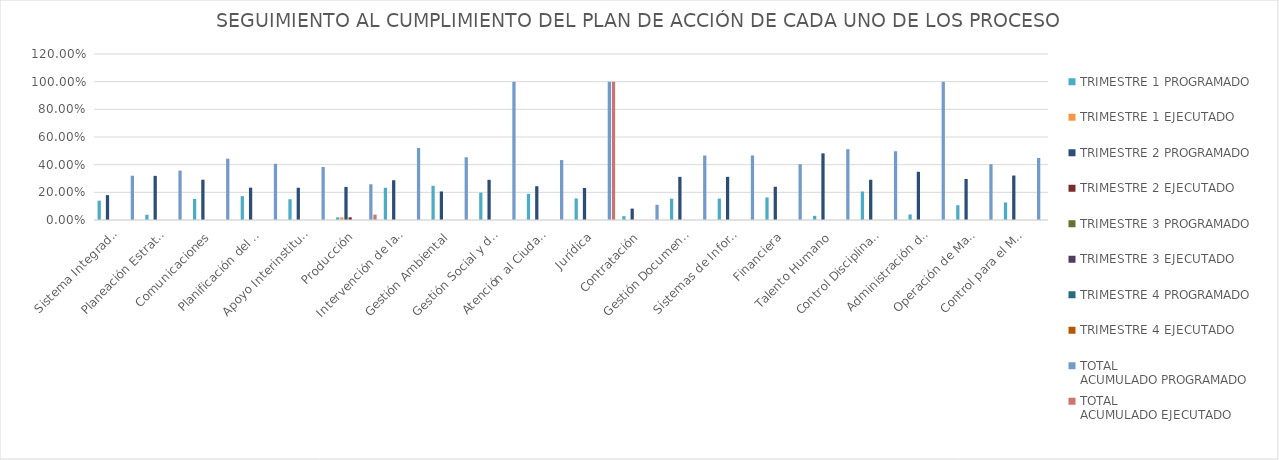
| Category | TRIMESTRE 1 | TRIMESTRE 2 | TRIMESTRE 3 | TRIMESTRE 4 | TOTAL
ACUMULADO |
|---|---|---|---|---|---|
| Sistema Integrado de Gestión | 0 | 0 | 0 | 0 | 0 |
| Planeación Estratégica | 0 | 0 | 0 | 0 | 0 |
| Comunicaciones | 0 | 0 | 0 | 0 | 0 |
| Planificación del Desarrollo Vial Local | 0 | 0 | 0 | 0 | 0 |
| Apoyo Interinstitucional | 0 | 0 | 0 | 0 | 0 |
| Producción | 0.019 | 0.019 | 0 | 0 | 0.038 |
| Intervención de la Malla Vial Local | 0 | 0 | 0 | 0 | 0 |
| Gestión Ambiental | 0 | 0 | 0 | 0 | 0 |
| Gestión Social y de Atención a Partes Interesadas | 0 | 0 | 0 | 0 | 0 |
| Atención al Ciudadano | 0 | 0 | 0 | 0 | 0 |
| Jurídica | 0 | 0 | 0 | 0 | 0.999 |
| Contratación | 0 | 0 | 0 | 0 | 0 |
| Gestión Documental | 0 | 0 | 0 | 0 | 0 |
| Sistemas de Información y Tecnología | 0 | 0 | 0 | 0 | 0 |
| Financiera | 0 | 0 | 0 | 0 | 0 |
| Talento Humano | 0 | 0 | 0 | 0 | 0 |
| Control Disciplinario Interno | 0 | 0 | 0 | 0 | 0 |
| Administración de Bienes e Infraestructura | 0 | 0 | 0 | 0 | 0 |
| Operación de Maquinaria | 0 | 0 | 0 | 0 | 0 |
| Control para el Mejoramiento Continuo de la Gestión | 0 | 0 | 0 | 0 | 0 |